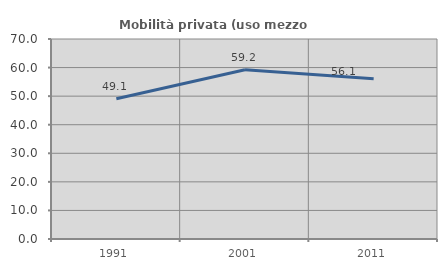
| Category | Mobilità privata (uso mezzo privato) |
|---|---|
| 1991.0 | 49.066 |
| 2001.0 | 59.234 |
| 2011.0 | 56.101 |